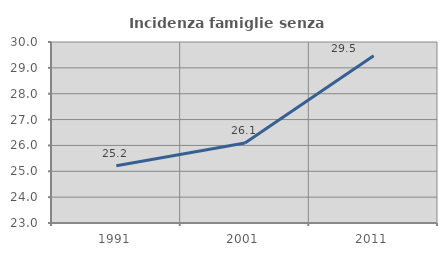
| Category | Incidenza famiglie senza nuclei |
|---|---|
| 1991.0 | 25.214 |
| 2001.0 | 26.095 |
| 2011.0 | 29.467 |